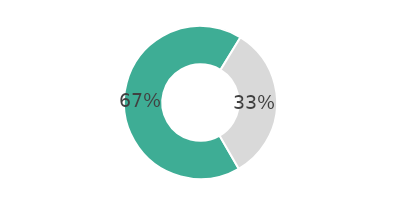
| Category | Series 0 |
|---|---|
| 0 | 67.084 |
| 1 | 32.916 |